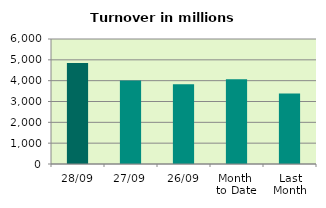
| Category | Series 0 |
|---|---|
| 28/09 | 4846.61 |
| 27/09 | 4002.882 |
| 26/09 | 3824.579 |
| Month 
to Date | 4066.242 |
| Last
Month | 3384.596 |